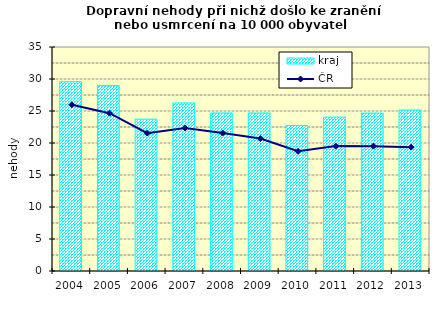
| Category | kraj |
|---|---|
| 2004.0 | 29.58 |
| 2005.0 | 28.974 |
| 2006.0 | 23.727 |
| 2007.0 | 26.26 |
| 2008.0 | 24.692 |
| 2009.0 | 24.693 |
| 2010.0 | 22.73 |
| 2011.0 | 24.044 |
| 2012.0 | 24.671 |
| 2013.0 | 25.155 |